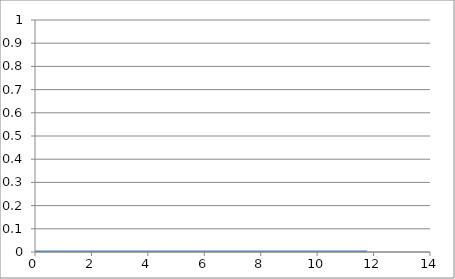
| Category | Series 0 |
|---|---|
| 0.0 | 0 |
| 2.943 | 0 |
| 5.886 | 0 |
| 8.829 | 0 |
| 11.772 | 0 |